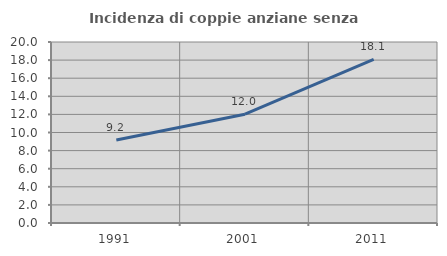
| Category | Incidenza di coppie anziane senza figli  |
|---|---|
| 1991.0 | 9.169 |
| 2001.0 | 12.023 |
| 2011.0 | 18.076 |